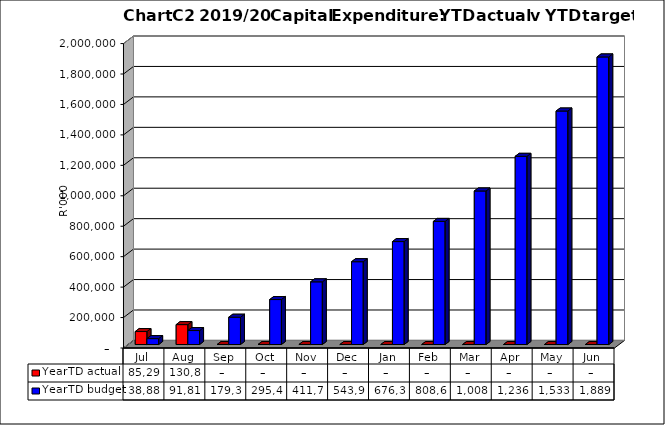
| Category | YearTD actual | YearTD budget |
|---|---|---|
| Jul | 85297669.12 | 38885000 |
| Aug | 130812960.887 | 91812000 |
| Sep | 0 | 179333000 |
| Oct | 0 | 295426000 |
| Nov | 0 | 411726000 |
| Dec | 0 | 543992000 |
| Jan | 0 | 676328000 |
| Feb | 0 | 808664000 |
| Mar | 0 | 1008547000 |
| Apr | 0 | 1236223000 |
| May | 0 | 1533926000 |
| Jun | 0 | 1889185999.6 |